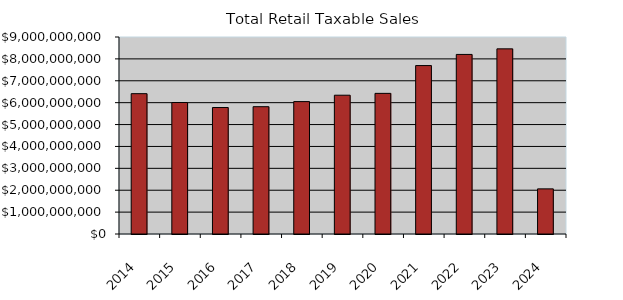
| Category | Series 0 |
|---|---|
| 2014.0 | 6411543250 |
| 2015.0 | 6006656784 |
| 2016.0 | 5778293947 |
| 2017.0 | 5815651079 |
| 2018.0 | 6048768442 |
| 2019.0 | 6340622737 |
| 2020.0 | 6425064749 |
| 2021.0 | 7694821723 |
| 2022.0 | 8203716329.5 |
| 2023.0 | 8458541337 |
| 2024.0 | 2061710631 |